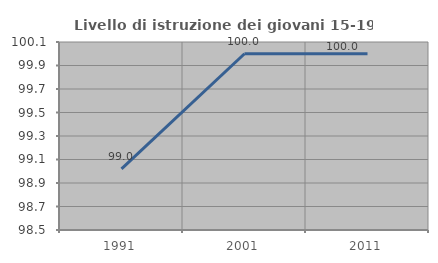
| Category | Livello di istruzione dei giovani 15-19 anni |
|---|---|
| 1991.0 | 99.02 |
| 2001.0 | 100 |
| 2011.0 | 100 |